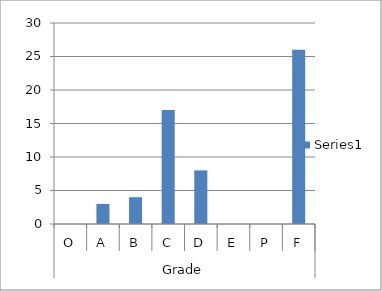
| Category | Series 0 |
|---|---|
| 0 | 0 |
| 1 | 3 |
| 2 | 4 |
| 3 | 17 |
| 4 | 8 |
| 5 | 0 |
| 6 | 0 |
| 7 | 26 |